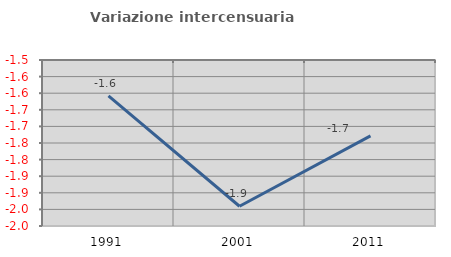
| Category | Variazione intercensuaria annua |
|---|---|
| 1991.0 | -1.608 |
| 2001.0 | -1.94 |
| 2011.0 | -1.728 |